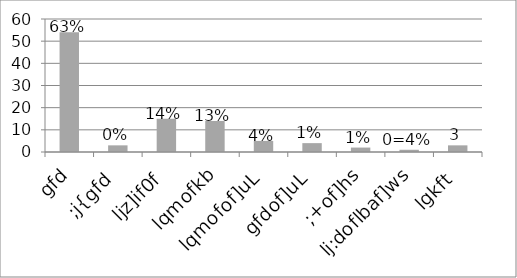
| Category | Series 0 |
|---|---|
| gfd | 54 |
| ;j{gfd | 3 |
| ljz]if0f | 15 |
| lqmofkb | 14 |
| lqmofof]uL | 5 |
| gfdof]uL | 4 |
| ;+of]hs | 2 |
| lj:doflbaf]ws | 1 |
| lgkft | 3 |